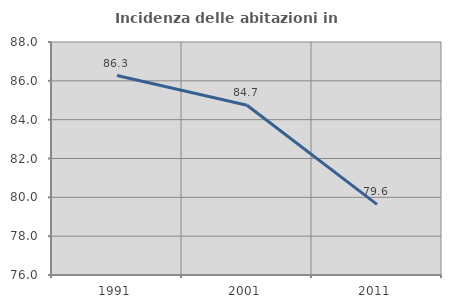
| Category | Incidenza delle abitazioni in proprietà  |
|---|---|
| 1991.0 | 86.275 |
| 2001.0 | 84.741 |
| 2011.0 | 79.634 |